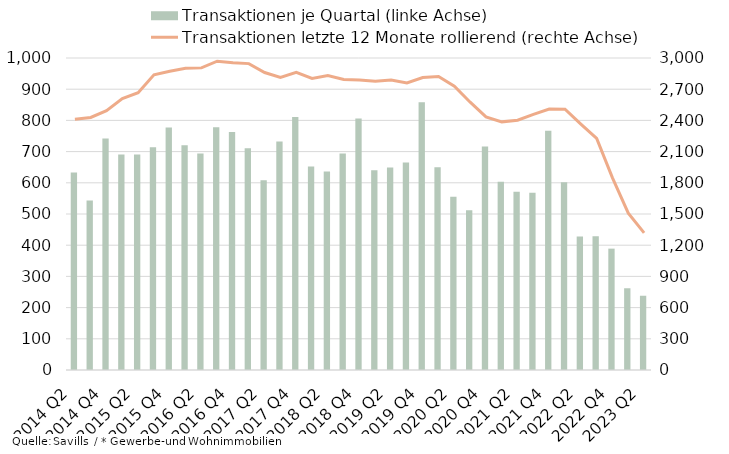
| Category | Transaktionen je Quartal (linke Achse) |
|---|---|
| 2014 Q2 | 633 |
| 2014 Q3 | 543 |
| 2014 Q4 | 742 |
| 2015 Q1 | 691 |
| 2015 Q2 | 691 |
| 2015 Q3 | 714 |
| 2015 Q4 | 777 |
| 2016 Q1 | 720 |
| 2016 Q2 | 694 |
| 2016 Q3 | 778 |
| 2016 Q4 | 763 |
| 2017 Q1 | 711 |
| 2017 Q2 | 608 |
| 2017 Q3 | 732 |
| 2017 Q4 | 811 |
| 2018 Q1 | 652 |
| 2018 Q2 | 636 |
| 2018 Q3 | 694 |
| 2018 Q4 | 806 |
| 2019 Q1 | 640 |
| 2019 Q2 | 649 |
| 2019 Q3 | 665 |
| 2019 Q4 | 858 |
| 2020 Q1 | 650 |
| 2020 Q2 | 555 |
| 2020 Q3 | 512 |
| 2020 Q4 | 716 |
| 2021 Q1 | 603 |
| 2021 Q2 | 571 |
| 2021 Q3 | 568 |
| 2021 Q4 | 767 |
| 2022 Q1 | 602 |
| 2022 Q2 | 428 |
| 2022 Q3 | 429 |
| 2022 Q4 | 389 |
| 2023 Q1 | 262 |
| 2023 Q2 | 238 |